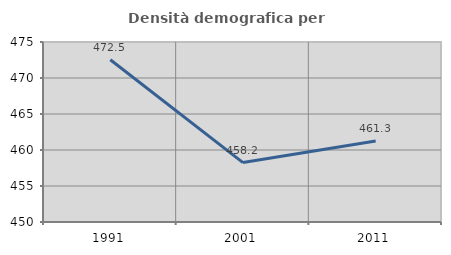
| Category | Densità demografica |
|---|---|
| 1991.0 | 472.539 |
| 2001.0 | 458.25 |
| 2011.0 | 461.252 |